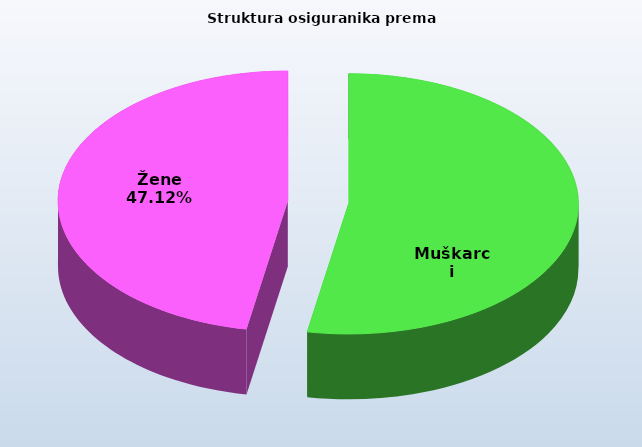
| Category | Series 0 |
|---|---|
| Muškarci | 845747 |
| Žene | 753763 |